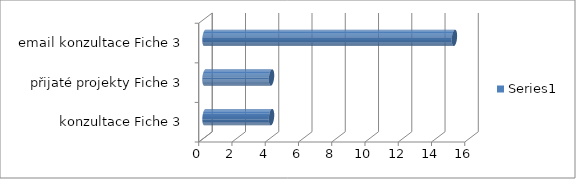
| Category | Series 0 |
|---|---|
|  konzultace Fiche 3 | 4 |
| přijaté projekty Fiche 3 | 4 |
| email konzultace Fiche 3 | 15 |